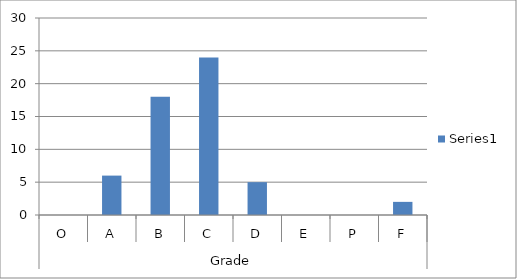
| Category | Series 0 |
|---|---|
| 0 | 0 |
| 1 | 6 |
| 2 | 18 |
| 3 | 24 |
| 4 | 5 |
| 5 | 0 |
| 6 | 0 |
| 7 | 2 |